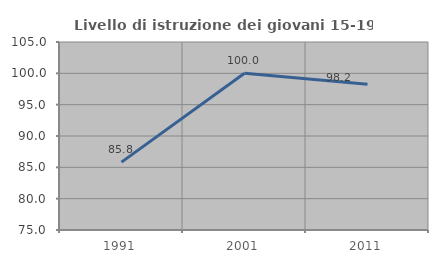
| Category | Livello di istruzione dei giovani 15-19 anni |
|---|---|
| 1991.0 | 85.827 |
| 2001.0 | 100 |
| 2011.0 | 98.246 |